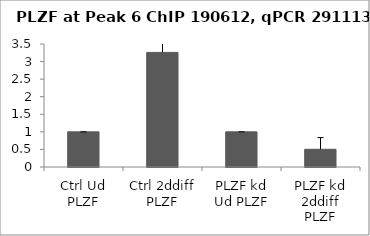
| Category | Series 0 |
|---|---|
| Ctrl Ud PLZF | 1 |
| Ctrl 2ddiff PLZF | 3.261 |
| PLZF kd Ud PLZF | 1 |
| PLZF kd 2ddiff PLZF | 0.504 |